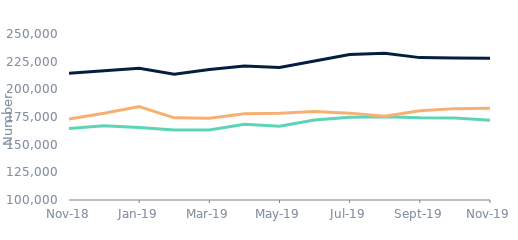
| Category | Homemovers | Homeowner remortgage | Remortgagors |
|---|---|---|---|
| 2018-11-01 | 164620.468 | 214516.196 | 173065.991 |
| 2018-12-01 | 167146.087 | 216885.557 | 178401.492 |
| 2019-01-01 | 165427.323 | 219056.564 | 184498.66 |
| 2019-02-01 | 163279.877 | 213639.901 | 174234.146 |
| 2019-03-01 | 163225.925 | 217851.555 | 173927.568 |
| 2019-04-01 | 168481.49 | 221108.132 | 177906.588 |
| 2019-05-01 | 166718.218 | 219786.052 | 178300.477 |
| 2019-06-01 | 172212.958 | 225618.493 | 179982.819 |
| 2019-07-01 | 174805.282 | 231480.739 | 178498.166 |
| 2019-08-01 | 175240.386 | 232581.694 | 175794.806 |
| 2019-09-01 | 174228.127 | 228660.61 | 180669.299 |
| 2019-10-01 | 173996.778 | 228297.338 | 182566.911 |
| 2019-11-01 | 172126.48 | 228043.45 | 182889.731 |